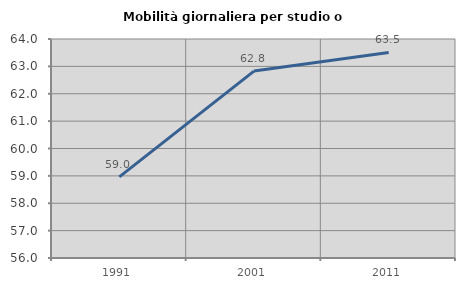
| Category | Mobilità giornaliera per studio o lavoro |
|---|---|
| 1991.0 | 58.962 |
| 2001.0 | 62.829 |
| 2011.0 | 63.507 |